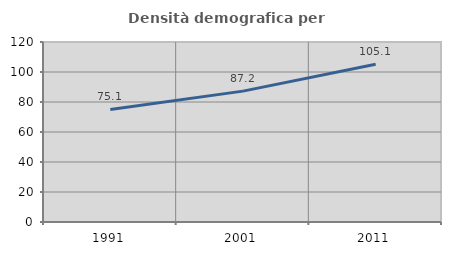
| Category | Densità demografica |
|---|---|
| 1991.0 | 75.067 |
| 2001.0 | 87.246 |
| 2011.0 | 105.136 |